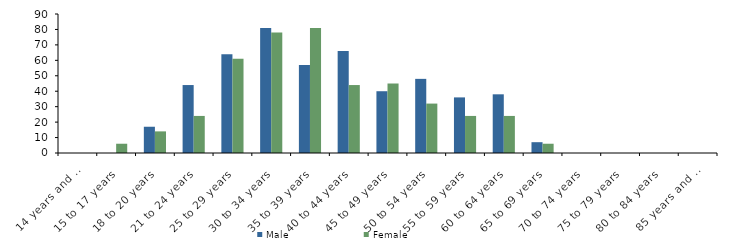
| Category | Male | Female |
|---|---|---|
| 14 years and under | 0 | 0 |
| 15 to 17 years | 0 | 6 |
| 18 to 20 years | 17 | 14 |
| 21 to 24 years | 44 | 24 |
| 25 to 29 years | 64 | 61 |
| 30 to 34 years | 81 | 78 |
| 35 to 39 years | 57 | 81 |
| 40 to 44 years | 66 | 44 |
| 45 to 49 years | 40 | 45 |
| 50 to 54 years | 48 | 32 |
| 55 to 59 years | 36 | 24 |
| 60 to 64 years | 38 | 24 |
| 65 to 69 years | 7 | 6 |
| 70 to 74 years | 0 | 0 |
| 75 to 79 years | 0 | 0 |
| 80 to 84 years | 0 | 0 |
| 85 years and over | 0 | 0 |